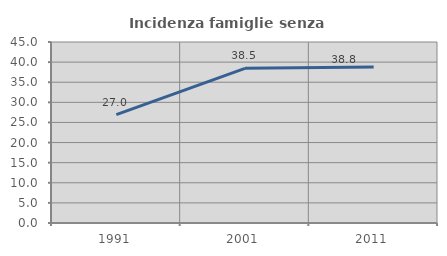
| Category | Incidenza famiglie senza nuclei |
|---|---|
| 1991.0 | 26.957 |
| 2001.0 | 38.462 |
| 2011.0 | 38.806 |